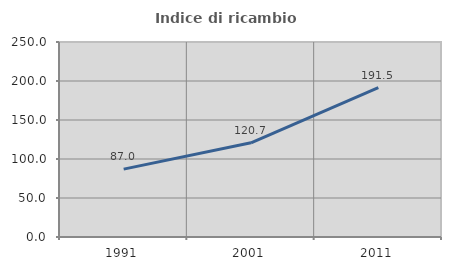
| Category | Indice di ricambio occupazionale  |
|---|---|
| 1991.0 | 87.037 |
| 2001.0 | 120.732 |
| 2011.0 | 191.549 |